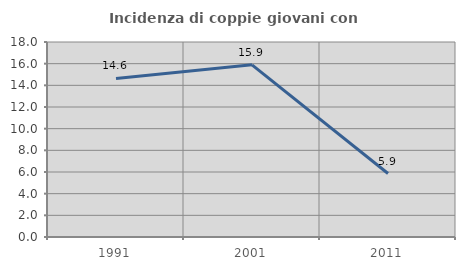
| Category | Incidenza di coppie giovani con figli |
|---|---|
| 1991.0 | 14.634 |
| 2001.0 | 15.891 |
| 2011.0 | 5.858 |